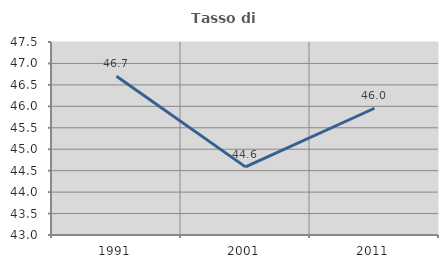
| Category | Tasso di occupazione   |
|---|---|
| 1991.0 | 46.7 |
| 2001.0 | 44.589 |
| 2011.0 | 45.955 |